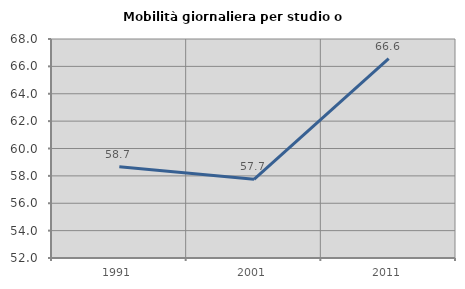
| Category | Mobilità giornaliera per studio o lavoro |
|---|---|
| 1991.0 | 58.659 |
| 2001.0 | 57.746 |
| 2011.0 | 66.564 |